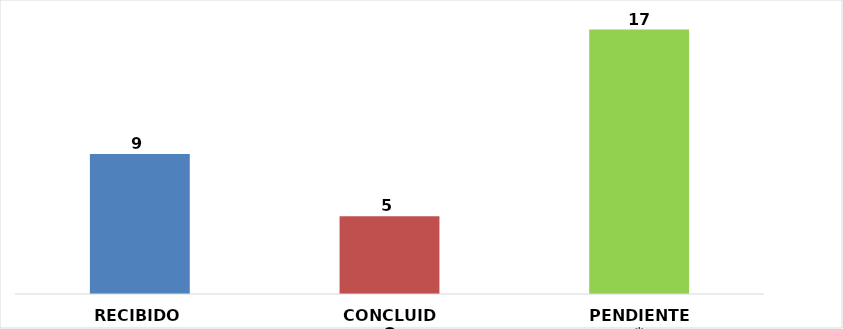
| Category | RECIBIDO |
|---|---|
| RECIBIDO | 9 |
| CONCLUIDO | 5 |
| PENDIENTE* | 17 |